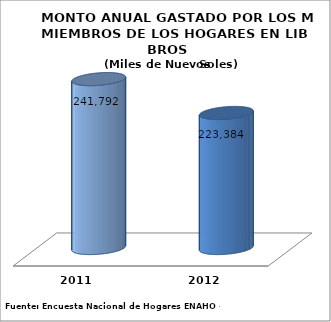
| Category | MONTO ANUAL GASTADO POR LOS MIEMBROS DE LOS HOGARES EN LIBROS |
|---|---|
| 2011.0 | 241792.468 |
| 2012.0 | 223384.165 |